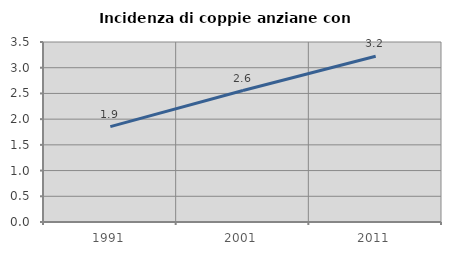
| Category | Incidenza di coppie anziane con figli |
|---|---|
| 1991.0 | 1.855 |
| 2001.0 | 2.557 |
| 2011.0 | 3.222 |